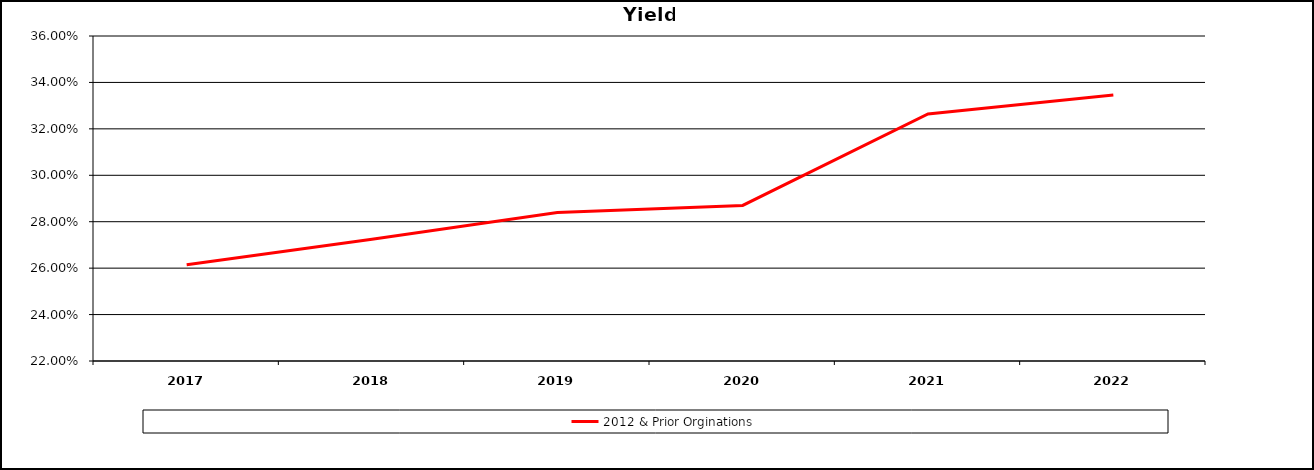
| Category | 2012 & Prior Orginations  |
|---|---|
| 2017.0 | 0.262 |
| 2018.0 | 0.272 |
| 2019.0 | 0.284 |
| 2020.0 | 0.287 |
| 2021.0 | 0.326 |
| 2022.0 | 0.335 |